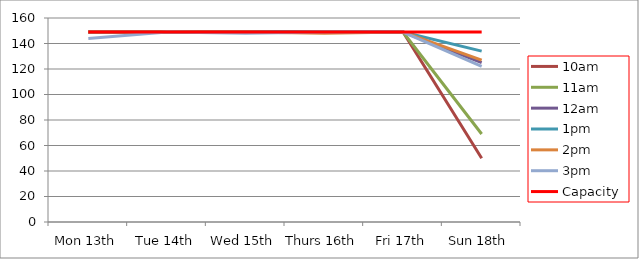
| Category | 9am | 10am | 11am | 12am | 1pm | 2pm | 3pm | 4pm | 5pm | Capacity |
|---|---|---|---|---|---|---|---|---|---|---|
| Mon 13th |  | 149 | 149 | 149 | 149 | 149 | 144 |  |  | 149 |
| Tue 14th |  | 149 | 149 | 149 | 149 | 149 | 149 |  |  | 149 |
| Wed 15th |  | 149 | 149 | 149 | 149 | 149 | 148 |  |  | 149 |
| Thurs 16th |  | 149 | 149 | 149 | 149 | 148 | 149 |  |  | 149 |
| Fri 17th |  | 149 | 149 | 149 | 149 | 149 | 149 |  |  | 149 |
| Sun 18th |  | 50 | 69 | 125 | 134 | 127 | 122 |  |  | 149 |